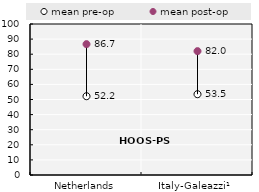
| Category | mean pre-op | mean post-op |
|---|---|---|
| Netherlands | 52.169 | 86.665 |
| Italy-Galeazzi¹ | 53.51 | 82.03 |